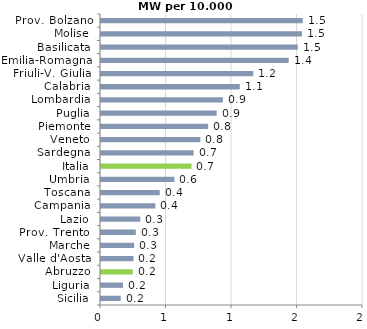
| Category | Series 0 |
|---|---|
| Sicilia | 0.151 |
| Liguria | 0.168 |
| Abruzzo | 0.242 |
| Valle d'Aosta | 0.248 |
| Marche | 0.253 |
| Prov. Trento  | 0.266 |
| Lazio | 0.3 |
| Campania | 0.415 |
| Toscana | 0.448 |
| Umbria | 0.561 |
| Italia | 0.691 |
| Sardegna | 0.707 |
| Veneto | 0.758 |
| Piemonte | 0.818 |
| Puglia | 0.883 |
| Lombardia | 0.93 |
| Calabria | 1.059 |
| Friuli-V. Giulia | 1.162 |
| Emilia-Romagna | 1.433 |
| Basilicata | 1.502 |
| Molise | 1.534 |
| Prov. Bolzano | 1.539 |